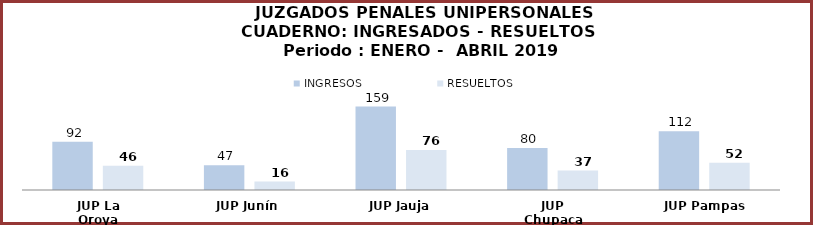
| Category | INGRESOS | RESUELTOS |
|---|---|---|
| JUP La Oroya | 92 | 46 |
| JUP Junín | 47 | 16 |
| JUP Jauja | 159 | 76 |
| JUP Chupaca | 80 | 37 |
| JUP Pampas | 112 | 52 |